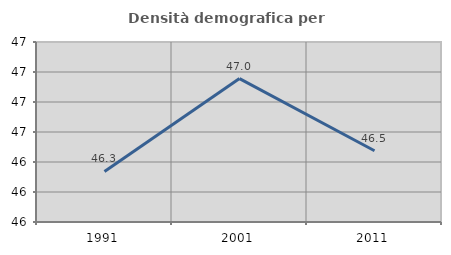
| Category | Densità demografica |
|---|---|
| 1991.0 | 46.337 |
| 2001.0 | 46.956 |
| 2011.0 | 46.475 |